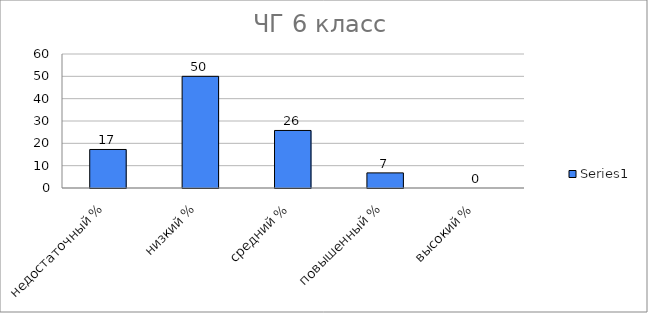
| Category | Series 0 |
|---|---|
| недостаточный % | 17.249 |
| низкий % | 50 |
| средний % | 25.764 |
| повышенный % | 6.769 |
| высокий % | 0 |